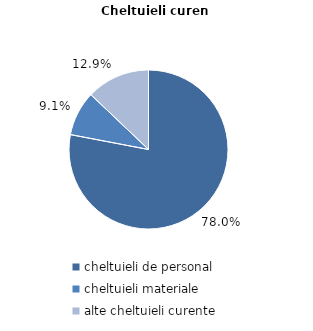
| Category | Series 0 |
|---|---|
| cheltuieli de personal | 78 |
| cheltuieli materiale | 9.1 |
| alte cheltuieli curente | 12.9 |